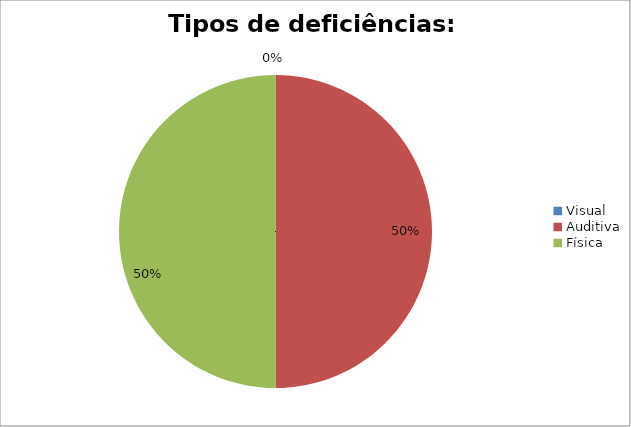
| Category | Tipos de deficiências: Quantitativo |
|---|---|
| Visual | 0 |
| Auditiva | 1 |
| Física | 1 |